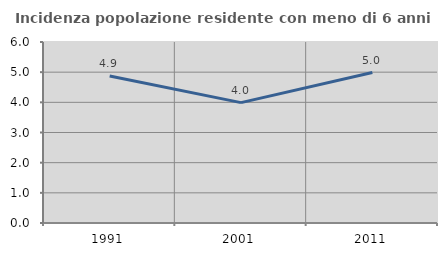
| Category | Incidenza popolazione residente con meno di 6 anni |
|---|---|
| 1991.0 | 4.87 |
| 2001.0 | 3.991 |
| 2011.0 | 4.987 |